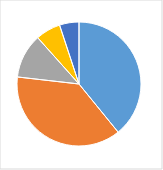
| Category | Series 0 |
|---|---|
| 0 | 0.391 |
| 1 | 0.377 |
| 2 | 0.116 |
| 3 | 0.065 |
| 4 | 0.051 |